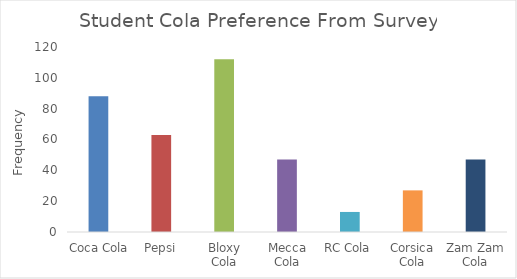
| Category | Frequency (Count) |
|---|---|
| Coca Cola | 88 |
| Pepsi | 63 |
| Bloxy Cola | 112 |
| Mecca Cola | 47 |
| RC Cola | 13 |
| Corsica Cola | 27 |
| Zam Zam Cola | 47 |